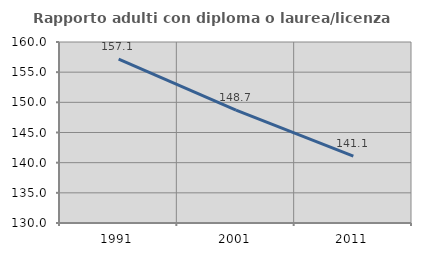
| Category | Rapporto adulti con diploma o laurea/licenza media  |
|---|---|
| 1991.0 | 157.143 |
| 2001.0 | 148.718 |
| 2011.0 | 141.071 |